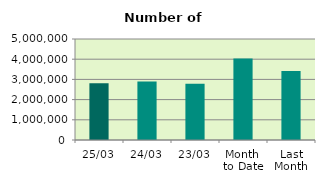
| Category | Series 0 |
|---|---|
| 25/03 | 2811728 |
| 24/03 | 2895196 |
| 23/03 | 2788872 |
| Month 
to Date | 4036626.632 |
| Last
Month | 3413232.3 |